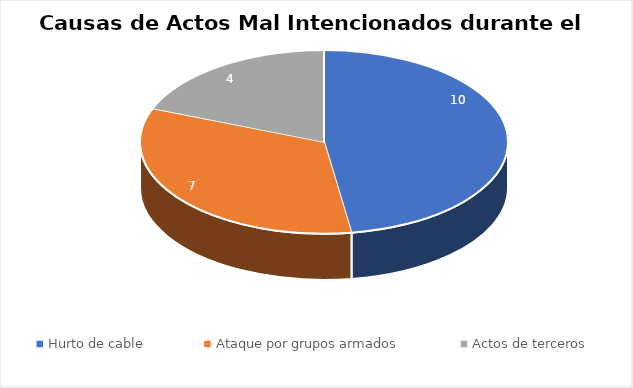
| Category | Series 0 |
|---|---|
| Hurto de cable | 10 |
| Ataque por grupos armados | 7 |
| Actos de terceros | 4 |